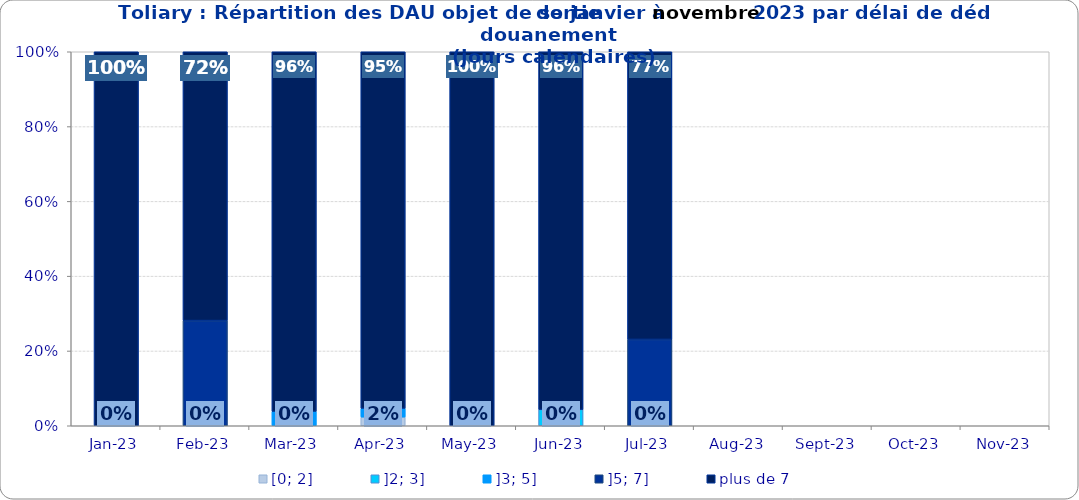
| Category | [0; 2] | ]2; 3] | ]3; 5] | ]5; 7] | plus de 7 |
|---|---|---|---|---|---|
| 2023-01-01 | 0 | 0 | 0 | 0 | 1 |
| 2023-02-01 | 0 | 0 | 0 | 0.281 | 0.719 |
| 2023-03-01 | 0 | 0 | 0.038 | 0 | 0.962 |
| 2023-04-01 | 0.023 | 0 | 0.023 | 0 | 0.953 |
| 2023-05-01 | 0 | 0 | 0 | 0 | 1 |
| 2023-06-01 | 0 | 0.043 | 0 | 0 | 0.957 |
| 2023-07-01 | 0 | 0 | 0 | 0.231 | 0.769 |
| 2023-08-01 | 0 | 0 | 0 | 0 | 0 |
| 2023-09-01 | 0 | 0 | 0 | 0 | 0 |
| 2023-10-01 | 0 | 0 | 0 | 0 | 0 |
| 2023-11-01 | 0 | 0 | 0 | 0 | 0 |